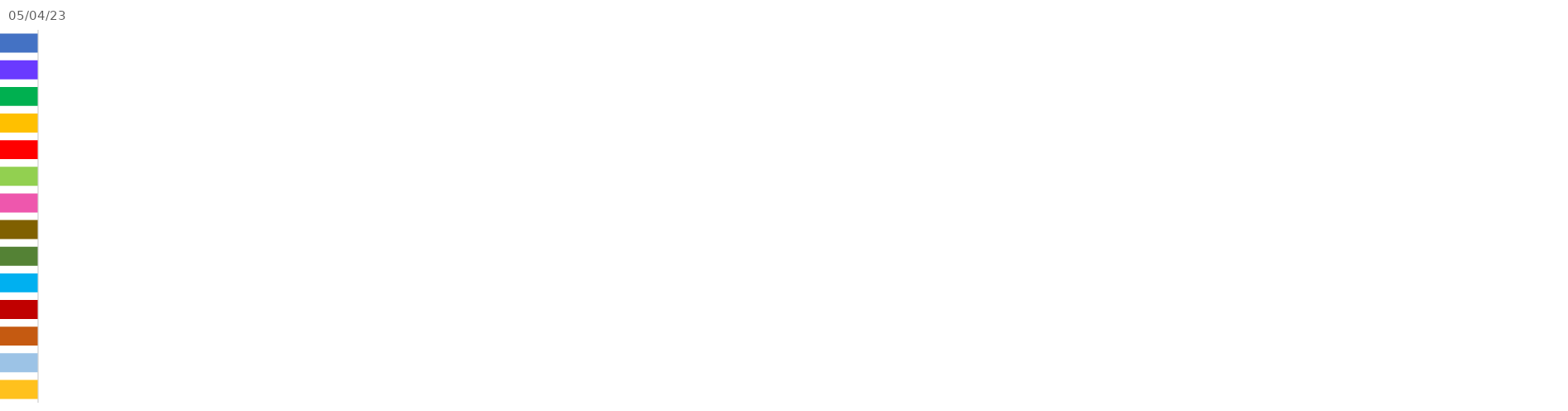
| Category | START 
DATE | Duration |
|---|---|---|
|  |  | 1 |
|  |  | 1 |
|  |  | 1 |
|  |  | 1 |
|  |  | 1 |
|  |  | 1 |
|  |  | 1 |
|  |  | 1 |
|  |  | 1 |
|  |  | 1 |
|  |  | 1 |
|  |  | 1 |
|  |  | 1 |
|  |  | 1 |